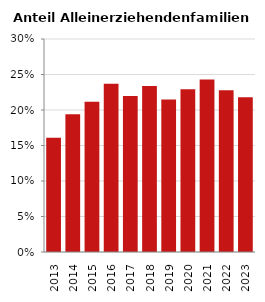
| Category | Anteil Alleinerziehende an Familien |
|---|---|
| 2013.0 | 0.161 |
| 2014.0 | 0.194 |
| 2015.0 | 0.212 |
| 2016.0 | 0.237 |
| 2017.0 | 0.22 |
| 2018.0 | 0.234 |
| 2019.0 | 0.215 |
| 2020.0 | 0.229 |
| 2021.0 | 0.243 |
| 2022.0 | 0.228 |
| 2023.0 | 0.218 |